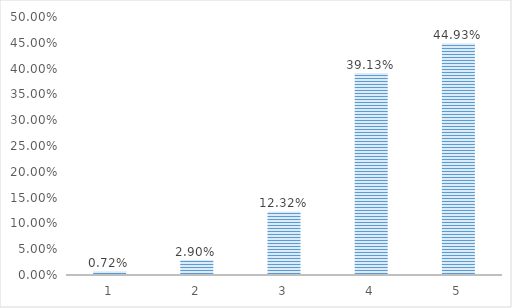
| Category | Series 0 |
|---|---|
| 1.0 | 0.007 |
| 2.0 | 0.029 |
| 3.0 | 0.123 |
| 4.0 | 0.391 |
| 5.0 | 0.449 |